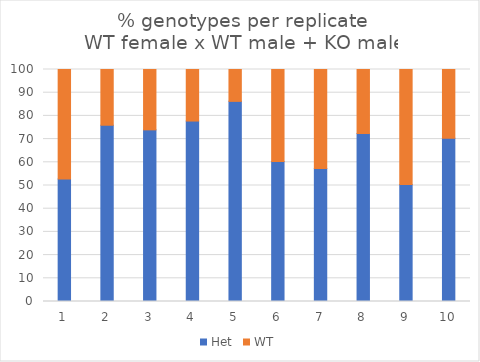
| Category | Het | WT |
|---|---|---|
| 0 | 52.821 | 47.179 |
| 1 | 75.978 | 24.022 |
| 2 | 73.98 | 26.02 |
| 3 | 77.778 | 22.222 |
| 4 | 86.264 | 13.736 |
| 5 | 60.385 | 39.615 |
| 6 | 57.31 | 42.69 |
| 7 | 72.376 | 27.624 |
| 8 | 50.446 | 49.554 |
| 9 | 70.414 | 29.586 |